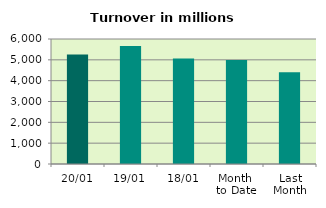
| Category | Series 0 |
|---|---|
| 20/01 | 5261.283 |
| 19/01 | 5667.316 |
| 18/01 | 5068.044 |
| Month 
to Date | 4995.474 |
| Last
Month | 4407.558 |